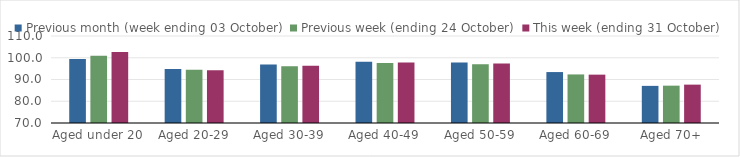
| Category | Previous month (week ending 03 October) | Previous week (ending 24 October) | This week (ending 31 October) |
|---|---|---|---|
| Aged under 20 | 99.43 | 100.87 | 102.63 |
| Aged 20-29 | 94.88 | 94.51 | 94.25 |
| Aged 30-39 | 96.85 | 96.08 | 96.33 |
| Aged 40-49 | 98.12 | 97.61 | 97.81 |
| Aged 50-59 | 97.78 | 96.98 | 97.33 |
| Aged 60-69 | 93.42 | 92.33 | 92.23 |
| Aged 70+ | 87.07 | 87.17 | 87.64 |